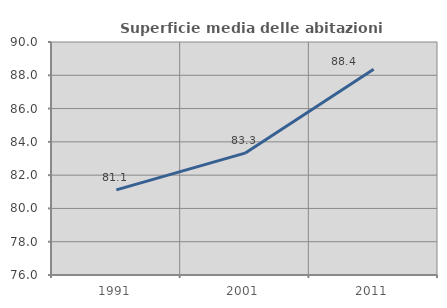
| Category | Superficie media delle abitazioni occupate |
|---|---|
| 1991.0 | 81.112 |
| 2001.0 | 83.322 |
| 2011.0 | 88.362 |